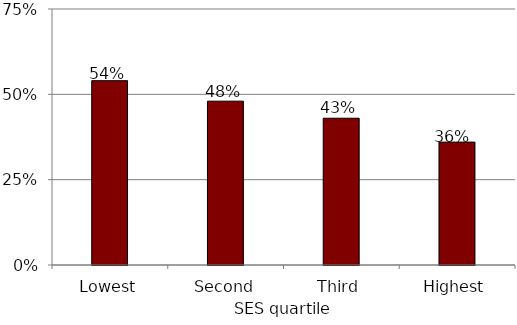
| Category | Series 0 |
|---|---|
| Lowest | 0.54 |
| Second | 0.48 |
| Third | 0.43 |
| Highest | 0.36 |